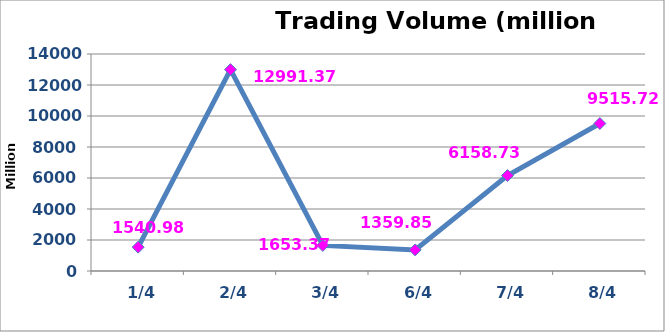
| Category | القيمة المتداولة |
|---|---|
|  1/4 | 1540981069 |
|  2/4 | 12991378839 |
|  3/4 | 1653376400 |
|  6/4 | 1359858683 |
|  7/4 | 6158732195 |
|  8/4 | 9515725217 |